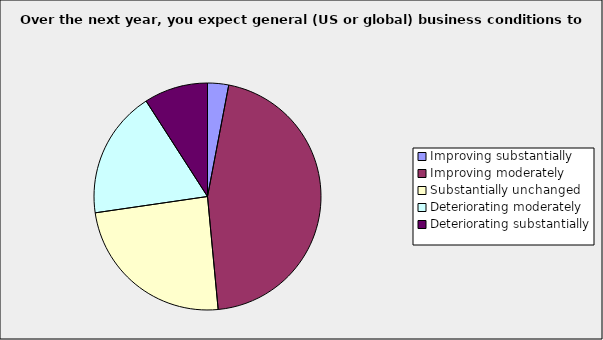
| Category | Series 0 |
|---|---|
| Improving substantially | 0.03 |
| Improving moderately | 0.455 |
| Substantially unchanged | 0.242 |
| Deteriorating moderately | 0.182 |
| Deteriorating substantially | 0.091 |